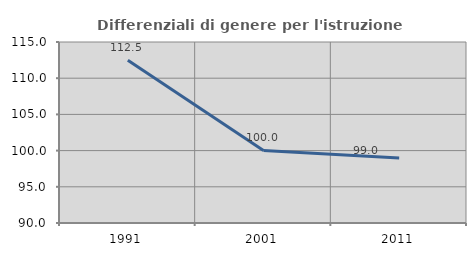
| Category | Differenziali di genere per l'istruzione superiore |
|---|---|
| 1991.0 | 112.463 |
| 2001.0 | 100.014 |
| 2011.0 | 98.993 |